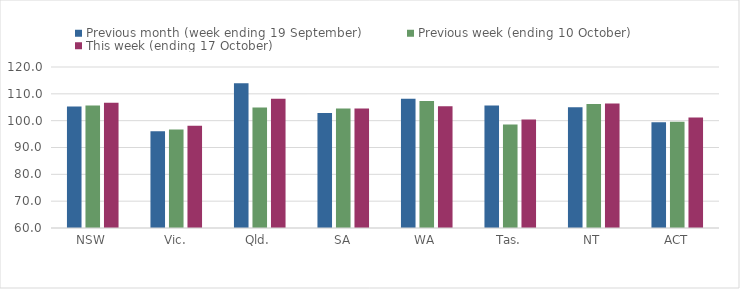
| Category | Previous month (week ending 19 September) | Previous week (ending 10 October) | This week (ending 17 October) |
|---|---|---|---|
| NSW | 105.27 | 105.66 | 106.67 |
| Vic. | 96.05 | 96.72 | 98.1 |
| Qld. | 113.95 | 104.95 | 108.14 |
| SA | 102.82 | 104.51 | 104.51 |
| WA | 108.15 | 107.32 | 105.36 |
| Tas. | 105.66 | 98.54 | 100.44 |
| NT | 104.96 | 106.2 | 106.4 |
| ACT | 99.38 | 99.56 | 101.2 |